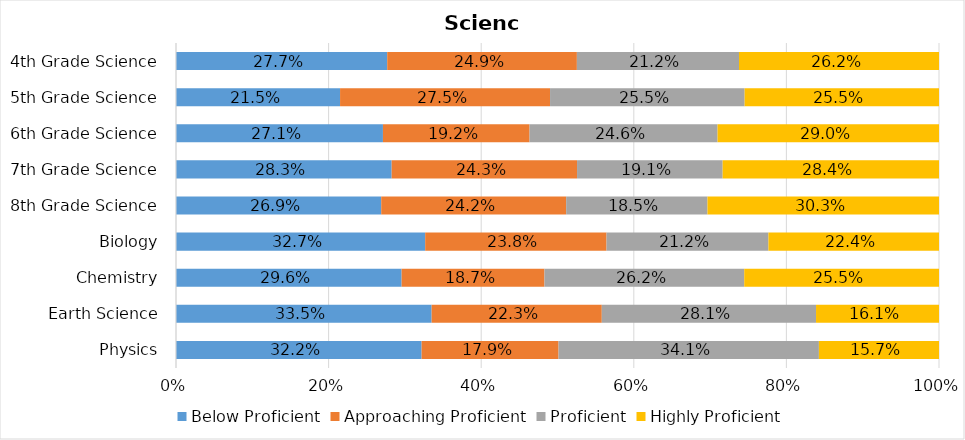
| Category | Below Proficient | Approaching Proficient | Proficient | Highly Proficient |
|---|---|---|---|---|
| Physics | 0.322 | 0.179 | 0.341 | 0.157 |
| Earth Science | 0.335 | 0.223 | 0.281 | 0.161 |
| Chemistry | 0.296 | 0.187 | 0.262 | 0.255 |
| Biology | 0.327 | 0.238 | 0.212 | 0.224 |
| 8th Grade Science | 0.269 | 0.242 | 0.185 | 0.303 |
| 7th Grade Science | 0.283 | 0.243 | 0.191 | 0.284 |
| 6th Grade Science | 0.271 | 0.192 | 0.246 | 0.29 |
| 5th Grade Science | 0.215 | 0.275 | 0.255 | 0.255 |
| 4th Grade Science | 0.277 | 0.249 | 0.212 | 0.262 |